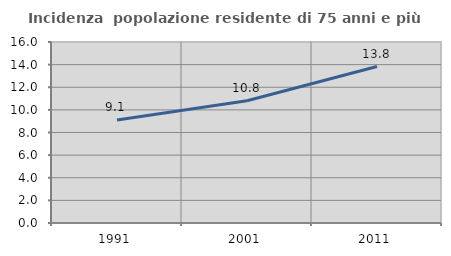
| Category | Incidenza  popolazione residente di 75 anni e più |
|---|---|
| 1991.0 | 9.112 |
| 2001.0 | 10.81 |
| 2011.0 | 13.829 |